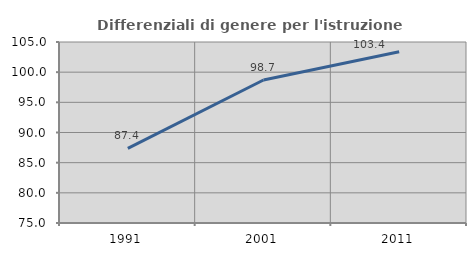
| Category | Differenziali di genere per l'istruzione superiore |
|---|---|
| 1991.0 | 87.362 |
| 2001.0 | 98.706 |
| 2011.0 | 103.376 |